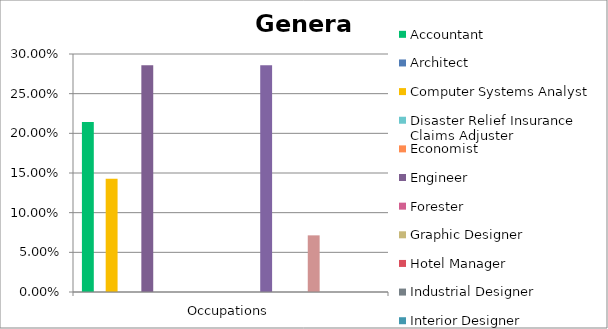
| Category | Accountant | Architect | Computer Systems Analyst | Disaster Relief Insurance Claims Adjuster | Economist | Engineer | Forester | Graphic Designer | Hotel Manager | Industrial Designer | Interior Designer | Land Surveyor | Landscape Architect | Lawyer | Librarian | Management Consultant | Mathematician (including Statistician) | Range Manager/Range Conservationist | Research Assistant (in a post-secondary institution) | Scientific Technician/Technologist | Social Worker | Sylviculturist (including Forestry Specialist) | Technical Publications Writer | Urban Planner (including Geographer) | Vocational Counselor |
|---|---|---|---|---|---|---|---|---|---|---|---|---|---|---|---|---|---|---|---|---|---|---|---|---|---|
| Occupations | 0.214 | 0 | 0.143 | 0 | 0 | 0.286 | 0 | 0 | 0 | 0 | 0 | 0 | 0 | 0 | 0 | 0.286 | 0 | 0 | 0 | 0.071 | 0 | 0 | 0 | 0 | 0 |